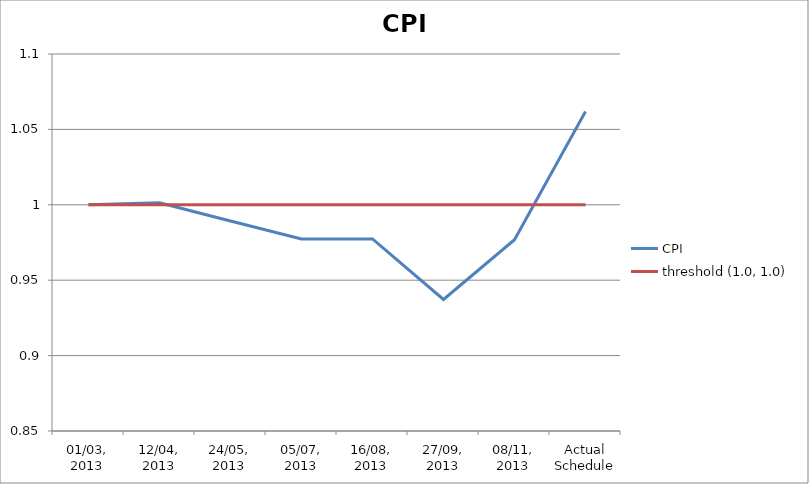
| Category | CPI | threshold (1.0, 1.0) |
|---|---|---|
| 01/03, 2013 | 1 | 1 |
| 12/04, 2013 | 1.001 | 1 |
| 24/05, 2013 | 0.989 | 1 |
| 05/07, 2013 | 0.977 | 1 |
| 16/08, 2013 | 0.977 | 1 |
| 27/09, 2013 | 0.937 | 1 |
| 08/11, 2013 | 0.977 | 1 |
| Actual Schedule | 1.062 | 1 |